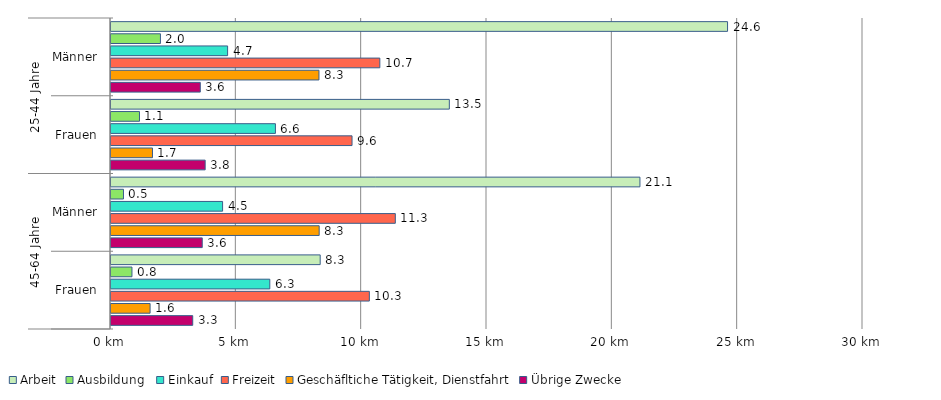
| Category | Arbeit | Ausbildung  | Einkauf | Freizeit | Geschäfltiche Tätigkeit, Dienstfahrt | Übrige Zwecke |
|---|---|---|---|---|---|---|
| 0 | 24.596 | 1.972 | 4.651 | 10.725 | 8.296 | 3.562 |
| 1 | 13.498 | 1.136 | 6.56 | 9.616 | 1.655 | 3.757 |
| 2 | 21.102 | 0.498 | 4.452 | 11.342 | 8.305 | 3.64 |
| 3 | 8.346 | 0.836 | 6.335 | 10.306 | 1.559 | 3.26 |